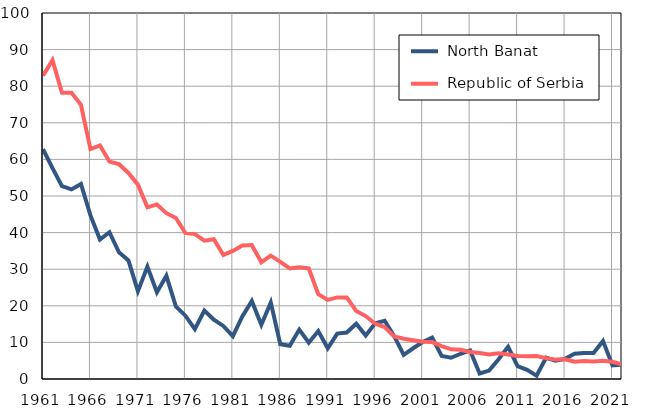
| Category |  North Banat |  Republic of Serbia |
|---|---|---|
| 1961.0 | 62.8 | 82.9 |
| 1962.0 | 57.6 | 87.1 |
| 1963.0 | 52.7 | 78.2 |
| 1964.0 | 51.8 | 78.2 |
| 1965.0 | 53.3 | 74.9 |
| 1966.0 | 44.7 | 62.8 |
| 1967.0 | 38.1 | 63.8 |
| 1968.0 | 40.1 | 59.4 |
| 1969.0 | 34.6 | 58.7 |
| 1970.0 | 32.4 | 56.3 |
| 1971.0 | 24 | 53.1 |
| 1972.0 | 30.7 | 46.9 |
| 1973.0 | 23.7 | 47.7 |
| 1974.0 | 28.2 | 45.3 |
| 1975.0 | 19.8 | 44 |
| 1976.0 | 17.3 | 39.9 |
| 1977.0 | 13.6 | 39.6 |
| 1978.0 | 18.7 | 37.8 |
| 1979.0 | 16.2 | 38.2 |
| 1980.0 | 14.5 | 33.9 |
| 1981.0 | 11.7 | 35 |
| 1982.0 | 17.1 | 36.5 |
| 1983.0 | 21.3 | 36.6 |
| 1984.0 | 14.8 | 31.9 |
| 1985.0 | 20.9 | 33.7 |
| 1986.0 | 9.5 | 32 |
| 1987.0 | 9.1 | 30.2 |
| 1988.0 | 13.5 | 30.5 |
| 1989.0 | 9.9 | 30.2 |
| 1990.0 | 13.1 | 23.2 |
| 1991.0 | 8.4 | 21.6 |
| 1992.0 | 12.4 | 22.3 |
| 1993.0 | 12.7 | 22.3 |
| 1994.0 | 15.1 | 18.6 |
| 1995.0 | 11.9 | 17.2 |
| 1996.0 | 15.2 | 15.1 |
| 1997.0 | 15.9 | 14.2 |
| 1998.0 | 11.7 | 11.6 |
| 1999.0 | 6.6 | 11 |
| 2000.0 | 8.4 | 10.6 |
| 2001.0 | 10.1 | 10.2 |
| 2002.0 | 11.3 | 10.1 |
| 2003.0 | 6.3 | 9 |
| 2004.0 | 5.8 | 8.1 |
| 2005.0 | 6.9 | 8 |
| 2006.0 | 7.8 | 7.4 |
| 2007.0 | 1.5 | 7.1 |
| 2008.0 | 2.3 | 6.7 |
| 2009.0 | 5.4 | 7 |
| 2010.0 | 8.8 | 6.7 |
| 2011.0 | 3.5 | 6.3 |
| 2012.0 | 2.5 | 6.2 |
| 2013.0 | 0.9 | 6.3 |
| 2014.0 | 5.8 | 5.7 |
| 2015.0 | 5 | 5.3 |
| 2016.0 | 5.5 | 5.4 |
| 2017.0 | 6.9 | 4.7 |
| 2018.0 | 7.1 | 4.9 |
| 2019.0 | 7.1 | 4.8 |
| 2020.0 | 10.4 | 5 |
| 2021.0 | 3.7 | 4.7 |
| 2022.0 | 3.9 | 4 |